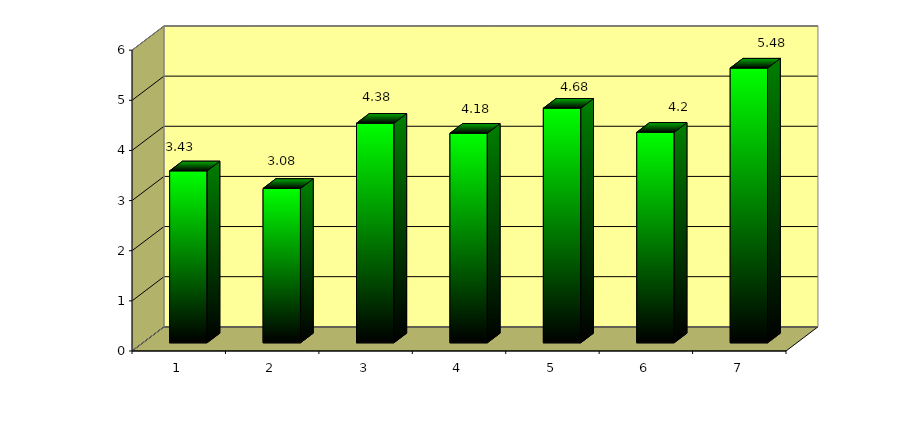
| Category | Series 0 |
|---|---|
| Amotivação | 3.43 |
| M. E. Regulação Externa | 3.08 |
| M. E. Introjeção | 4.38 |
| M. E. Identificação | 4.18 |
| M. I. Atingir Objetivos | 4.68 |
| M. I. Conhecer | 4.2 |
| M. I. Exp. Estimulantes | 5.48 |